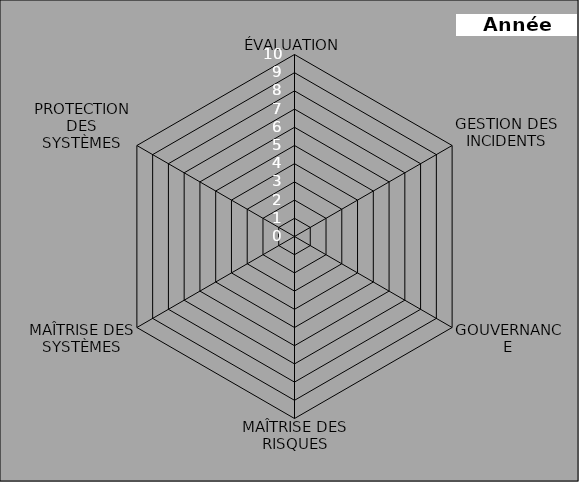
| Category | Series 0 |
|---|---|
| ÉVALUATION | 0 |
| GESTION DES INCIDENTS | 0 |
| GOUVERNANCE | 0 |
| MAÎTRISE DES RISQUES | 0 |
| MAÎTRISE DES SYSTÈMES | 0 |
| PROTECTION
DES SYSTÈMES | 0 |